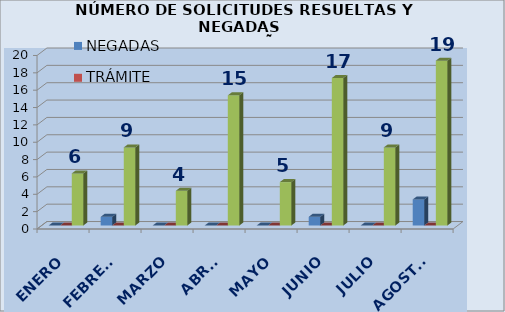
| Category | NEGADAS | TRÁMITE | RESUELTAS |
|---|---|---|---|
| ENERO | 0 | 0 | 6 |
| FEBRERO | 1 | 0 | 9 |
| MARZO | 0 | 0 | 4 |
| ABRIL | 0 | 0 | 15 |
| MAYO | 0 | 0 | 5 |
| JUNIO | 1 | 0 | 17 |
| JULIO | 0 | 0 | 9 |
| AGOSTO | 3 | 0 | 19 |